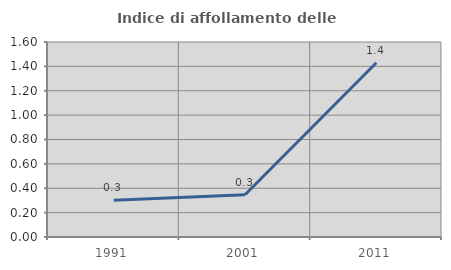
| Category | Indice di affollamento delle abitazioni  |
|---|---|
| 1991.0 | 0.301 |
| 2001.0 | 0.347 |
| 2011.0 | 1.43 |